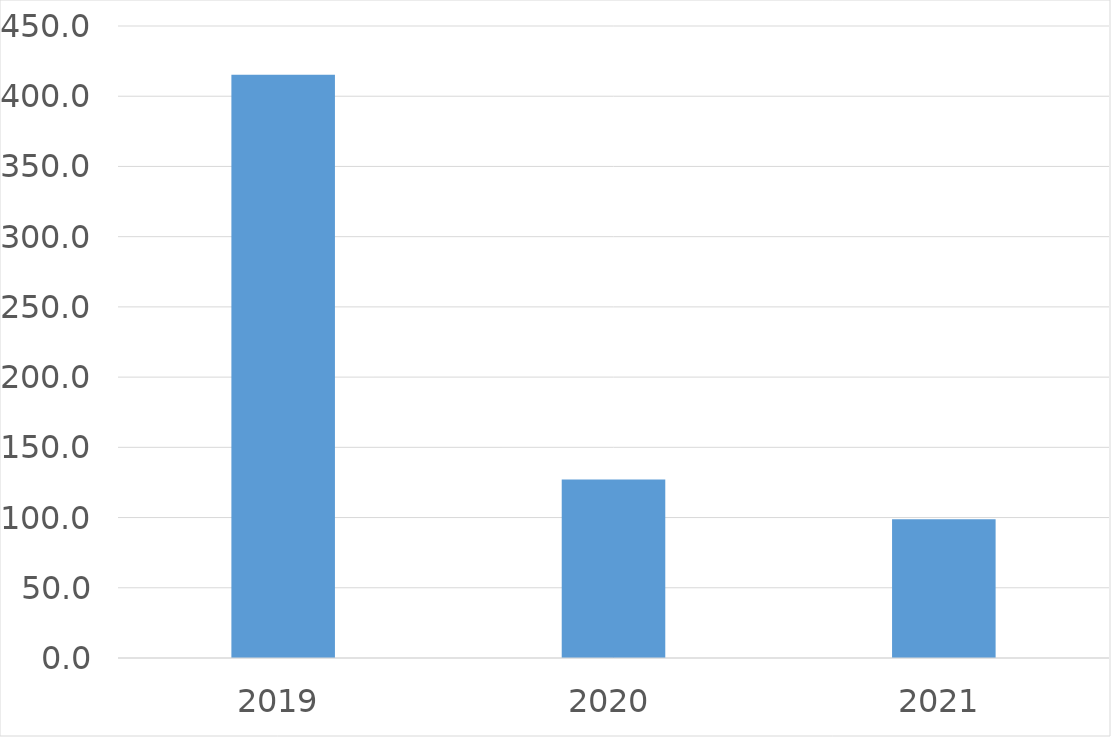
| Category | Series 0 |
|---|---|
| 2019 | 415.2 |
| 2020 | 127.1 |
| 2021 | 98.8 |